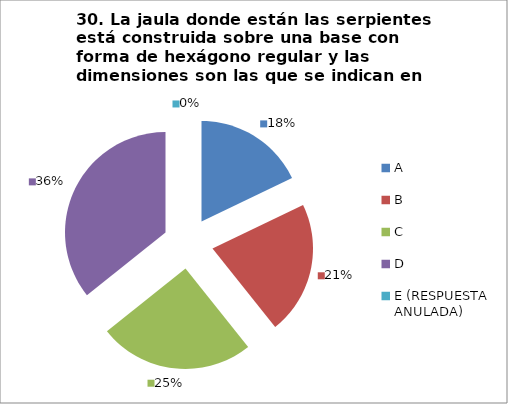
| Category | CANTIDAD DE RESPUESTAS PREGUNTA (30) | PORCENTAJE |
|---|---|---|
| A | 5 | 0.179 |
| B | 6 | 0.214 |
| C | 7 | 0.25 |
| D | 10 | 0.357 |
| E (RESPUESTA ANULADA) | 0 | 0 |